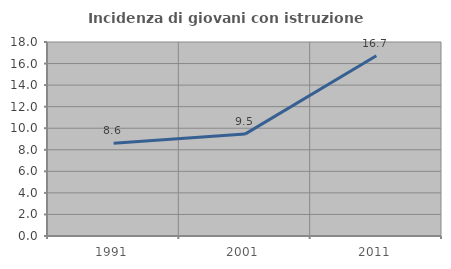
| Category | Incidenza di giovani con istruzione universitaria |
|---|---|
| 1991.0 | 8.614 |
| 2001.0 | 9.456 |
| 2011.0 | 16.721 |